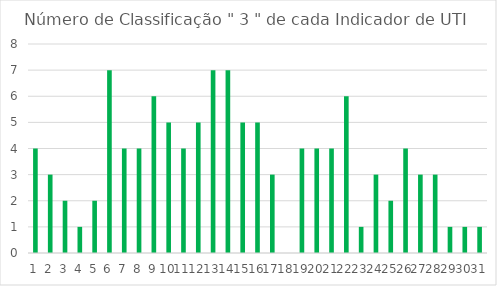
| Category | Series 0 |
|---|---|
| 0 | 4 |
| 1 | 3 |
| 2 | 2 |
| 3 | 1 |
| 4 | 2 |
| 5 | 7 |
| 6 | 4 |
| 7 | 4 |
| 8 | 6 |
| 9 | 5 |
| 10 | 4 |
| 11 | 5 |
| 12 | 7 |
| 13 | 7 |
| 14 | 5 |
| 15 | 5 |
| 16 | 3 |
| 17 | 0 |
| 18 | 4 |
| 19 | 4 |
| 20 | 4 |
| 21 | 6 |
| 22 | 1 |
| 23 | 3 |
| 24 | 2 |
| 25 | 4 |
| 26 | 3 |
| 27 | 3 |
| 28 | 1 |
| 29 | 1 |
| 30 | 1 |